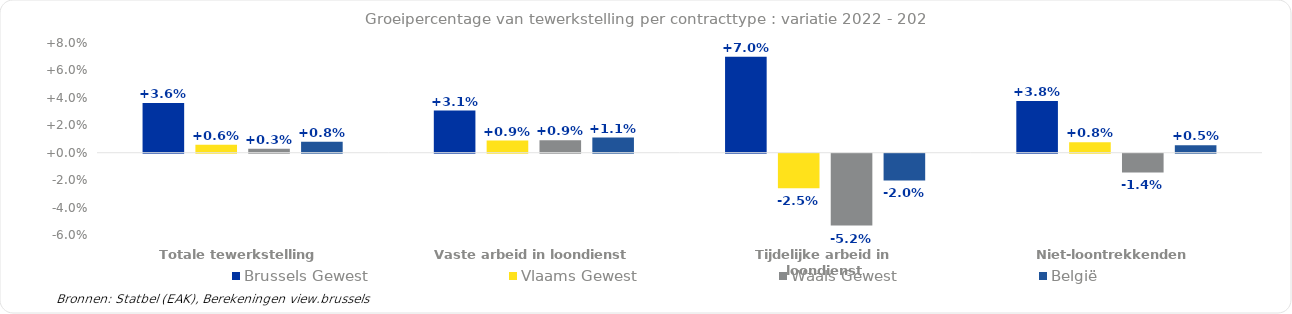
| Category | Brussels Gewest | Vlaams Gewest | Waals Gewest | België |
|---|---|---|---|---|
| Totale tewerkstelling | 0.036 | 0.006 | 0.003 | 0.008 |
| Vaste arbeid in loondienst | 0.031 | 0.009 | 0.009 | 0.011 |
| Tijdelijke arbeid in loondienst | 0.07 | -0.025 | -0.052 | -0.02 |
| Niet-loontrekkenden | 0.038 | 0.008 | -0.014 | 0.005 |